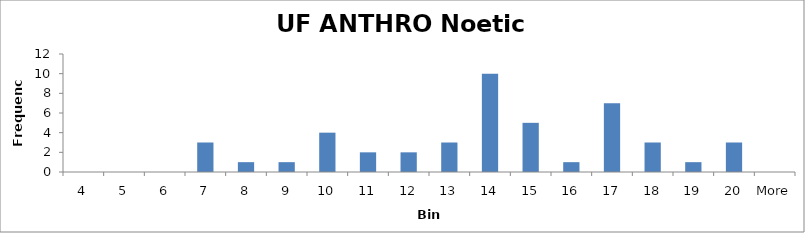
| Category | Frequency |
|---|---|
| 4 | 0 |
| 5 | 0 |
| 6 | 0 |
| 7 | 3 |
| 8 | 1 |
| 9 | 1 |
| 10 | 4 |
| 11 | 2 |
| 12 | 2 |
| 13 | 3 |
| 14 | 10 |
| 15 | 5 |
| 16 | 1 |
| 17 | 7 |
| 18 | 3 |
| 19 | 1 |
| 20 | 3 |
| More | 0 |